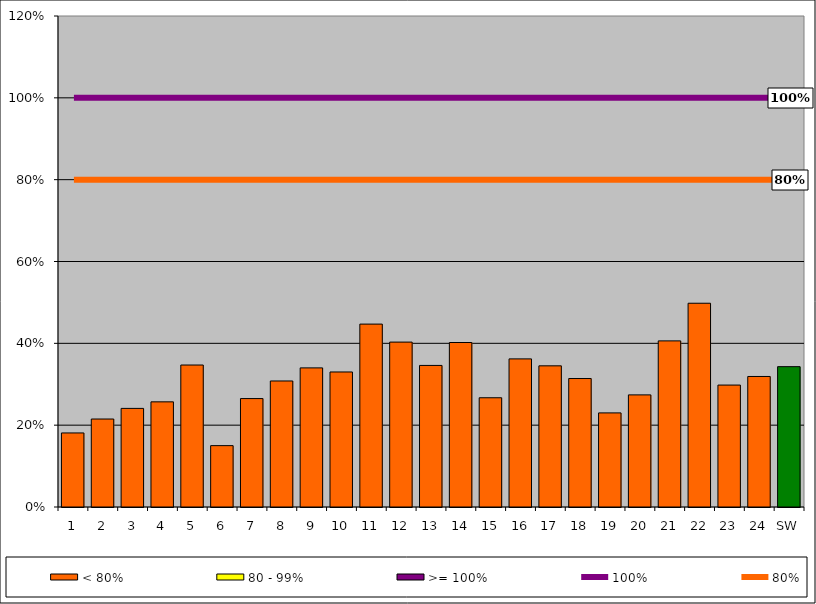
| Category | < 80% | 80 - 99% | >= 100% |
|---|---|---|---|
| 1 | 0.181 | 0 | 0 |
| 2 | 0.215 | 0 | 0 |
| 3 | 0.241 | 0 | 0 |
| 4 | 0.257 | 0 | 0 |
| 5 | 0.347 | 0 | 0 |
| 6 | 0.15 | 0 | 0 |
| 7 | 0.265 | 0 | 0 |
| 8 | 0.308 | 0 | 0 |
| 9 | 0.34 | 0 | 0 |
| 10 | 0.33 | 0 | 0 |
| 11 | 0.447 | 0 | 0 |
| 12 | 0.403 | 0 | 0 |
| 13 | 0.346 | 0 | 0 |
| 14 | 0.402 | 0 | 0 |
| 15 | 0.267 | 0 | 0 |
| 16 | 0.362 | 0 | 0 |
| 17 | 0.345 | 0 | 0 |
| 18 | 0.314 | 0 | 0 |
| 19 | 0.23 | 0 | 0 |
| 20 | 0.274 | 0 | 0 |
| 21 | 0.406 | 0 | 0 |
| 22 | 0.498 | 0 | 0 |
| 23 | 0.298 | 0 | 0 |
| 24 | 0.319 | 0 | 0 |
| SW | 0.343 | 0 | 0 |